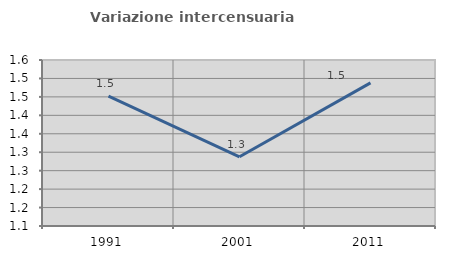
| Category | Variazione intercensuaria annua |
|---|---|
| 1991.0 | 1.452 |
| 2001.0 | 1.288 |
| 2011.0 | 1.488 |